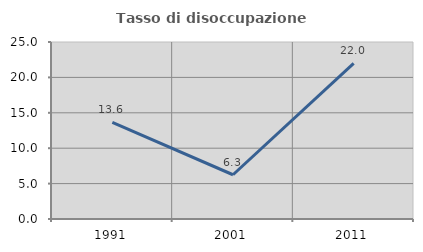
| Category | Tasso di disoccupazione giovanile  |
|---|---|
| 1991.0 | 13.636 |
| 2001.0 | 6.25 |
| 2011.0 | 21.978 |